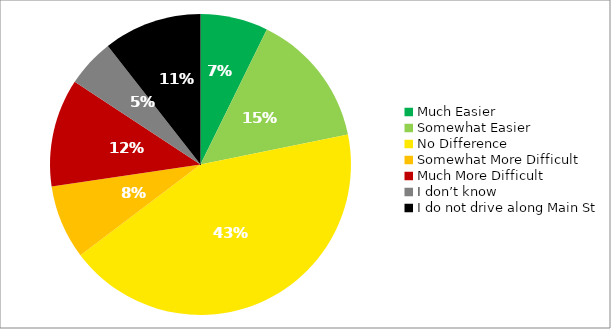
| Category | Responses |
|---|---|
| Much Easier | 0.073 |
| Somewhat Easier | 0.145 |
| No Difference | 0.429 |
| Somewhat More Difficult | 0.08 |
| Much More Difficult | 0.116 |
| I don’t know | 0.052 |
| I do not drive along Main St | 0.106 |